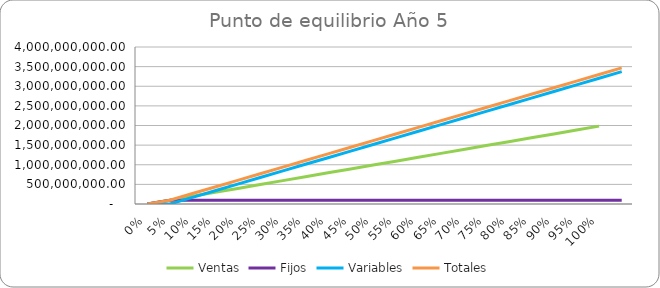
| Category | Ventas | Fijos | Variables | Totales |
|---|---|---|---|---|
| 0.0 | 0 | 0 | 0 | 0 |
| 0.05 | 99225000 | 97509462.06 | 0 | 97509462.06 |
| 0.1 | 198450000 | 97509462.06 | 168566796.058 | 266076258.119 |
| 0.15 | 297675000 | 97509462.06 | 337133592.116 | 434643054.177 |
| 0.2 | 396900000 | 97509462.06 | 505700388.174 | 603209850.235 |
| 0.25 | 496125000 | 97509462.06 | 674267184.232 | 771776646.293 |
| 0.3 | 595350000 | 97509462.06 | 842833980.29 | 940343442.351 |
| 0.35 | 694575000 | 97509462.06 | 1011400776.348 | 1108910238.409 |
| 0.4 | 793800000 | 97509462.06 | 1179967572.406 | 1277477034.467 |
| 0.45 | 893025000 | 97509462.06 | 1348534368.465 | 1446043830.525 |
| 0.5 | 992250000 | 97509462.06 | 1517101164.523 | 1614610626.583 |
| 0.55 | 1091475000 | 97509462.06 | 1685667960.581 | 1783177422.641 |
| 0.6 | 1190700000 | 97509462.06 | 1854234756.639 | 1951744218.699 |
| 0.65 | 1289925000 | 97509462.06 | 2022801552.697 | 2120311014.757 |
| 0.7 | 1389150000 | 97509462.06 | 2191368348.755 | 2288877810.815 |
| 0.75 | 1488375000 | 97509462.06 | 2359935144.813 | 2457444606.873 |
| 0.8 | 1587600000 | 97509462.06 | 2528501940.871 | 2626011402.932 |
| 0.85 | 1686825000 | 97509462.06 | 2697068736.929 | 2794578198.99 |
| 0.9 | 1786050000 | 97509462.06 | 2865635532.987 | 2963144995.048 |
| 0.95 | 1885275000 | 97509462.06 | 3034202329.045 | 3131711791.106 |
| 1.0 | 1984500000 | 97509462.06 | 3202769125.103 | 3300278587.164 |